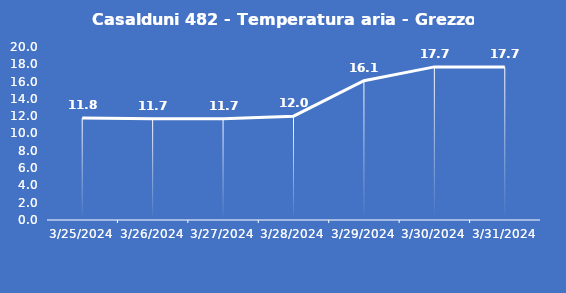
| Category | Casalduni 482 - Temperatura aria - Grezzo (°C) |
|---|---|
| 3/25/24 | 11.8 |
| 3/26/24 | 11.7 |
| 3/27/24 | 11.7 |
| 3/28/24 | 12 |
| 3/29/24 | 16.1 |
| 3/30/24 | 17.7 |
| 3/31/24 | 17.7 |